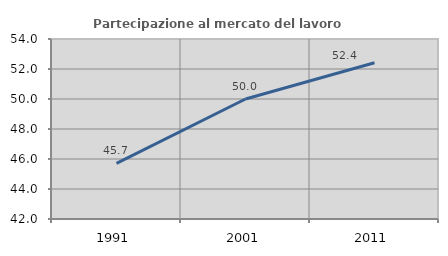
| Category | Partecipazione al mercato del lavoro  femminile |
|---|---|
| 1991.0 | 45.706 |
| 2001.0 | 50 |
| 2011.0 | 52.414 |